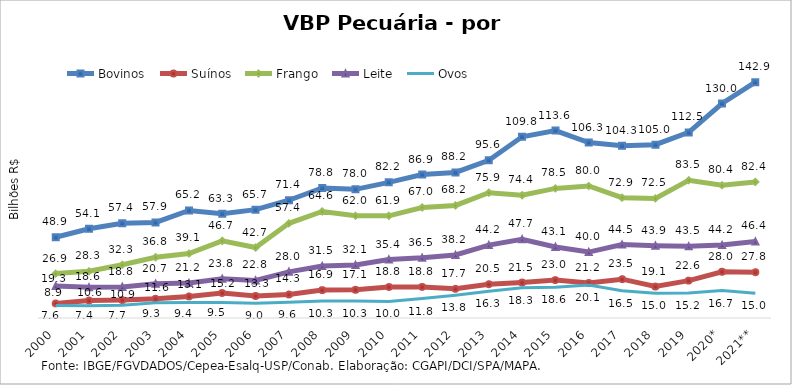
| Category | Bovinos | Suínos | Frango | Leite | Ovos |
|---|---|---|---|---|---|
| 2000 | 48.913 | 8.857 | 26.915 | 19.32 | 7.554 |
| 2001 | 54.069 | 10.625 | 28.289 | 18.592 | 7.444 |
| 2002 | 57.378 | 10.89 | 32.292 | 18.825 | 7.669 |
| 2003 | 57.909 | 11.639 | 36.815 | 20.731 | 9.277 |
| 2004 | 65.154 | 13.086 | 39.093 | 21.188 | 9.402 |
| 2005 | 63.256 | 15.172 | 46.738 | 23.83 | 9.466 |
| 2006 | 65.675 | 13.346 | 42.697 | 22.762 | 8.992 |
| 2007 | 71.373 | 14.271 | 57.368 | 27.983 | 9.557 |
| 2008 | 78.805 | 16.898 | 64.577 | 31.479 | 10.321 |
| 2009 | 77.983 | 17.081 | 62.003 | 32.093 | 10.291 |
| 2010 | 82.217 | 18.791 | 61.929 | 35.442 | 10.009 |
| 2011 | 86.916 | 18.82 | 66.979 | 36.537 | 11.794 |
| 2012 | 88.212 | 17.671 | 68.229 | 38.18 | 13.825 |
| 2013 | 95.59 | 20.461 | 75.939 | 44.181 | 16.26 |
| 2014 | 109.816 | 21.49 | 74.404 | 47.71 | 18.269 |
| 2015 | 113.596 | 22.967 | 78.547 | 43.066 | 18.602 |
| 2016 | 106.331 | 21.195 | 80.034 | 39.961 | 20.054 |
| 2017 | 104.345 | 23.528 | 72.897 | 44.524 | 16.53 |
| 2018 | 105.045 | 19.055 | 72.5 | 43.863 | 15.031 |
| 2019 | 112.48 | 22.649 | 83.476 | 43.456 | 15.223 |
| 2020* | 129.995 | 28.023 | 80.43 | 44.183 | 16.656 |
| 2021** | 142.923 | 27.75 | 82.433 | 46.402 | 14.977 |